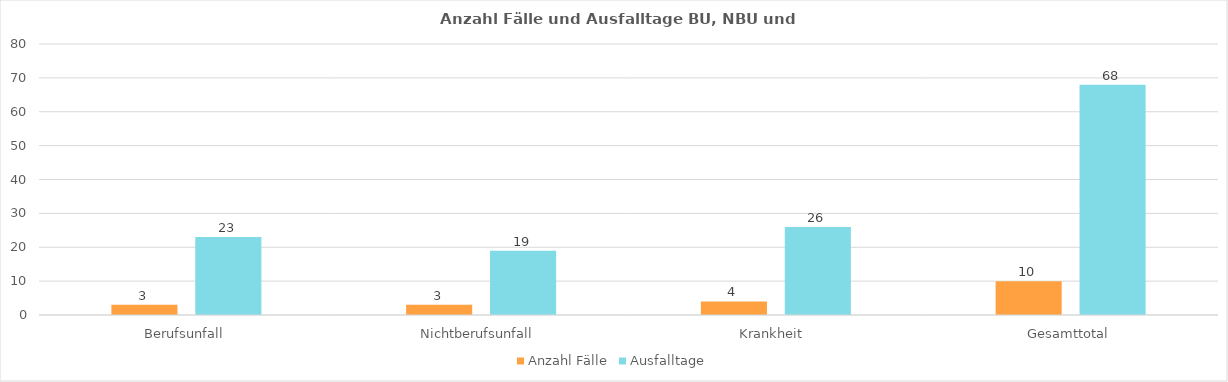
| Category | Anzahl Fälle | Ausfalltage |
|---|---|---|
| Berufsunfall | 3 | 23 |
| Nichtberufsunfall  | 3 | 19 |
| Krankheit  | 4 | 26 |
| Gesamttotal | 10 | 68 |